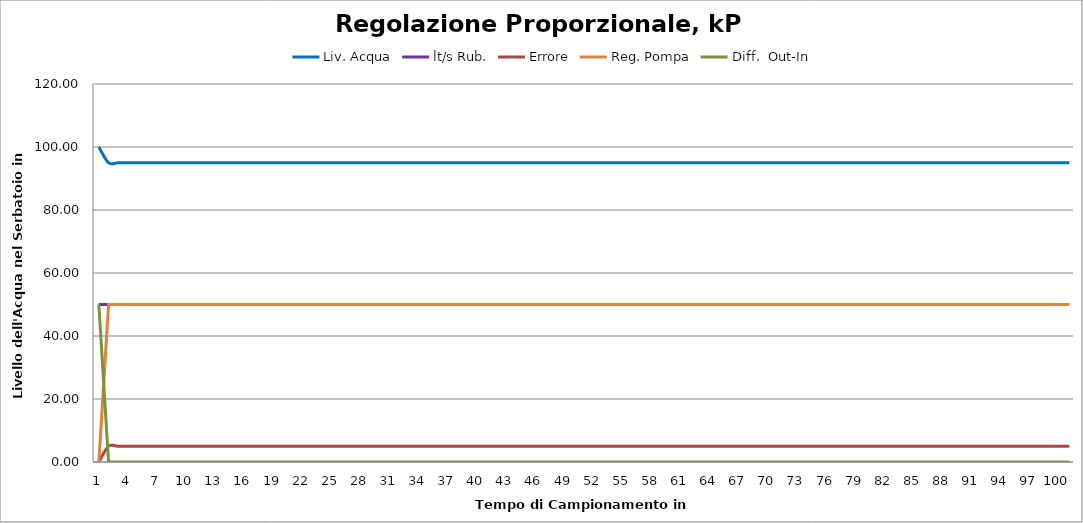
| Category | Liv. Acqua | lt/s Rub. | Errore | Reg. Pompa | Diff.  Out-In |
|---|---|---|---|---|---|
| 0 | 100 | 50 | 0 | 0 | 50 |
| 1 | 95 | 50 | 5 | 50 | 0 |
| 2 | 95 | 50 | 5 | 50 | 0 |
| 3 | 95 | 50 | 5 | 50 | 0 |
| 4 | 95 | 50 | 5 | 50 | 0 |
| 5 | 95 | 50 | 5 | 50 | 0 |
| 6 | 95 | 50 | 5 | 50 | 0 |
| 7 | 95 | 50 | 5 | 50 | 0 |
| 8 | 95 | 50 | 5 | 50 | 0 |
| 9 | 95 | 50 | 5 | 50 | 0 |
| 10 | 95 | 50 | 5 | 50 | 0 |
| 11 | 95 | 50 | 5 | 50 | 0 |
| 12 | 95 | 50 | 5 | 50 | 0 |
| 13 | 95 | 50 | 5 | 50 | 0 |
| 14 | 95 | 50 | 5 | 50 | 0 |
| 15 | 95 | 50 | 5 | 50 | 0 |
| 16 | 95 | 50 | 5 | 50 | 0 |
| 17 | 95 | 50 | 5 | 50 | 0 |
| 18 | 95 | 50 | 5 | 50 | 0 |
| 19 | 95 | 50 | 5 | 50 | 0 |
| 20 | 95 | 50 | 5 | 50 | 0 |
| 21 | 95 | 50 | 5 | 50 | 0 |
| 22 | 95 | 50 | 5 | 50 | 0 |
| 23 | 95 | 50 | 5 | 50 | 0 |
| 24 | 95 | 50 | 5 | 50 | 0 |
| 25 | 95 | 50 | 5 | 50 | 0 |
| 26 | 95 | 50 | 5 | 50 | 0 |
| 27 | 95 | 50 | 5 | 50 | 0 |
| 28 | 95 | 50 | 5 | 50 | 0 |
| 29 | 95 | 50 | 5 | 50 | 0 |
| 30 | 95 | 50 | 5 | 50 | 0 |
| 31 | 95 | 50 | 5 | 50 | 0 |
| 32 | 95 | 50 | 5 | 50 | 0 |
| 33 | 95 | 50 | 5 | 50 | 0 |
| 34 | 95 | 50 | 5 | 50 | 0 |
| 35 | 95 | 50 | 5 | 50 | 0 |
| 36 | 95 | 50 | 5 | 50 | 0 |
| 37 | 95 | 50 | 5 | 50 | 0 |
| 38 | 95 | 50 | 5 | 50 | 0 |
| 39 | 95 | 50 | 5 | 50 | 0 |
| 40 | 95 | 50 | 5 | 50 | 0 |
| 41 | 95 | 50 | 5 | 50 | 0 |
| 42 | 95 | 50 | 5 | 50 | 0 |
| 43 | 95 | 50 | 5 | 50 | 0 |
| 44 | 95 | 50 | 5 | 50 | 0 |
| 45 | 95 | 50 | 5 | 50 | 0 |
| 46 | 95 | 50 | 5 | 50 | 0 |
| 47 | 95 | 50 | 5 | 50 | 0 |
| 48 | 95 | 50 | 5 | 50 | 0 |
| 49 | 95 | 50 | 5 | 50 | 0 |
| 50 | 95 | 50 | 5 | 50 | 0 |
| 51 | 95 | 50 | 5 | 50 | 0 |
| 52 | 95 | 50 | 5 | 50 | 0 |
| 53 | 95 | 50 | 5 | 50 | 0 |
| 54 | 95 | 50 | 5 | 50 | 0 |
| 55 | 95 | 50 | 5 | 50 | 0 |
| 56 | 95 | 50 | 5 | 50 | 0 |
| 57 | 95 | 50 | 5 | 50 | 0 |
| 58 | 95 | 50 | 5 | 50 | 0 |
| 59 | 95 | 50 | 5 | 50 | 0 |
| 60 | 95 | 50 | 5 | 50 | 0 |
| 61 | 95 | 50 | 5 | 50 | 0 |
| 62 | 95 | 50 | 5 | 50 | 0 |
| 63 | 95 | 50 | 5 | 50 | 0 |
| 64 | 95 | 50 | 5 | 50 | 0 |
| 65 | 95 | 50 | 5 | 50 | 0 |
| 66 | 95 | 50 | 5 | 50 | 0 |
| 67 | 95 | 50 | 5 | 50 | 0 |
| 68 | 95 | 50 | 5 | 50 | 0 |
| 69 | 95 | 50 | 5 | 50 | 0 |
| 70 | 95 | 50 | 5 | 50 | 0 |
| 71 | 95 | 50 | 5 | 50 | 0 |
| 72 | 95 | 50 | 5 | 50 | 0 |
| 73 | 95 | 50 | 5 | 50 | 0 |
| 74 | 95 | 50 | 5 | 50 | 0 |
| 75 | 95 | 50 | 5 | 50 | 0 |
| 76 | 95 | 50 | 5 | 50 | 0 |
| 77 | 95 | 50 | 5 | 50 | 0 |
| 78 | 95 | 50 | 5 | 50 | 0 |
| 79 | 95 | 50 | 5 | 50 | 0 |
| 80 | 95 | 50 | 5 | 50 | 0 |
| 81 | 95 | 50 | 5 | 50 | 0 |
| 82 | 95 | 50 | 5 | 50 | 0 |
| 83 | 95 | 50 | 5 | 50 | 0 |
| 84 | 95 | 50 | 5 | 50 | 0 |
| 85 | 95 | 50 | 5 | 50 | 0 |
| 86 | 95 | 50 | 5 | 50 | 0 |
| 87 | 95 | 50 | 5 | 50 | 0 |
| 88 | 95 | 50 | 5 | 50 | 0 |
| 89 | 95 | 50 | 5 | 50 | 0 |
| 90 | 95 | 50 | 5 | 50 | 0 |
| 91 | 95 | 50 | 5 | 50 | 0 |
| 92 | 95 | 50 | 5 | 50 | 0 |
| 93 | 95 | 50 | 5 | 50 | 0 |
| 94 | 95 | 50 | 5 | 50 | 0 |
| 95 | 95 | 50 | 5 | 50 | 0 |
| 96 | 95 | 50 | 5 | 50 | 0 |
| 97 | 95 | 50 | 5 | 50 | 0 |
| 98 | 95 | 50 | 5 | 50 | 0 |
| 99 | 95 | 50 | 5 | 50 | 0 |
| 100 | 95 | 50 | 5 | 50 | 0 |